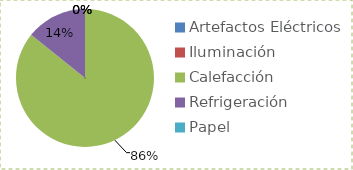
| Category | Series 0 |
|---|---|
| Artefactos Eléctricos | 0 |
| Iluminación | 0 |
| Calefacción | 7.897 |
| Refrigeración | 1.312 |
| Papel | 0 |